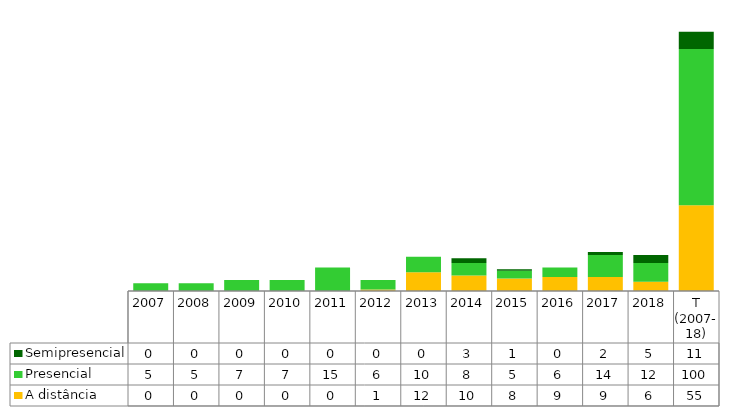
| Category | A distância | Presencial | Semipresencial |
|---|---|---|---|
| 2007 | 0 | 5 | 0 |
| 2008 | 0 | 5 | 0 |
| 2009 | 0 | 7 | 0 |
| 2010 | 0 | 7 | 0 |
| 2011 | 0 | 15 | 0 |
| 2012 | 1 | 6 | 0 |
| 2013 | 12 | 10 | 0 |
| 2014 | 10 | 8 | 3 |
| 2015 | 8 | 5 | 1 |
| 2016 | 9 | 6 | 0 |
| 2017 | 9 | 14 | 2 |
| 2018 | 6 | 12 | 5 |
| T (2007-18) | 55 | 100 | 11 |